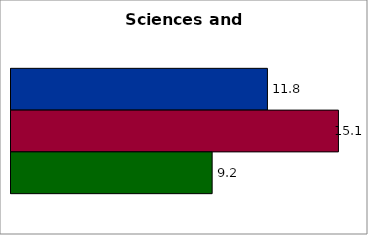
| Category | 50 states and D.C. | SREB states | State |
|---|---|---|---|
| 0 | 11.79 | 15.055 | 9.249 |